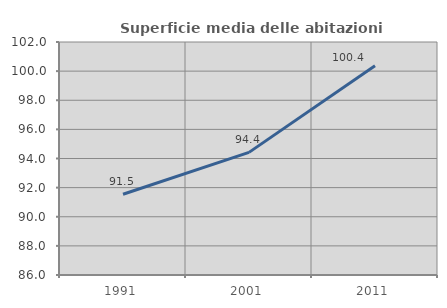
| Category | Superficie media delle abitazioni occupate |
|---|---|
| 1991.0 | 91.544 |
| 2001.0 | 94.42 |
| 2011.0 | 100.376 |